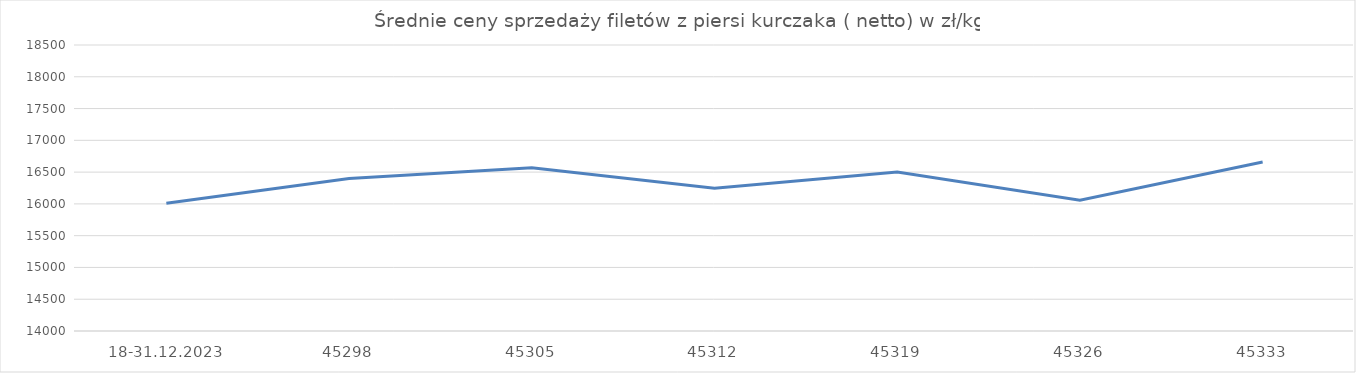
| Category | filety z piersi kurczaka |
|---|---|
| 18-31.12.2023 | 16010.609 |
| 45298 | 16398.99 |
| 45305 | 16568.176 |
| 45312 | 16247.114 |
| 45319 | 16501.438 |
| 45326 | 16056.924 |
| 45333 | 16658.132 |